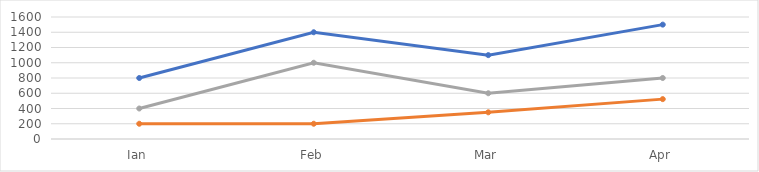
| Category | Cătălina | Daniel | Ioan |
|---|---|---|---|
| Ian | 800 | 200 | 400 |
| Feb | 1400 | 200 | 1000 |
| Mar | 1100 | 350 | 600 |
| Apr | 1500 | 523 | 800 |